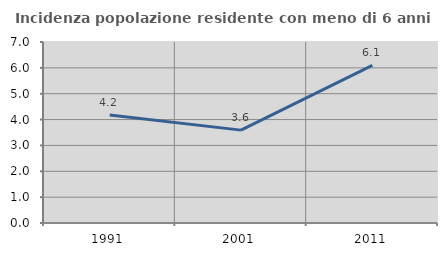
| Category | Incidenza popolazione residente con meno di 6 anni |
|---|---|
| 1991.0 | 4.181 |
| 2001.0 | 3.592 |
| 2011.0 | 6.098 |